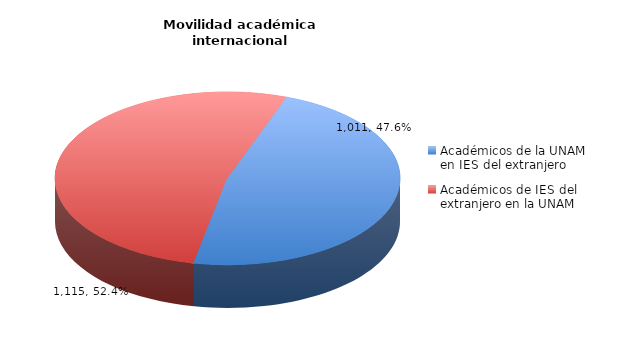
| Category | Series 0 |
|---|---|
| Académicos de la UNAM en IES del extranjero | 1011 |
| Académicos de IES del extranjero en la UNAM | 1115 |